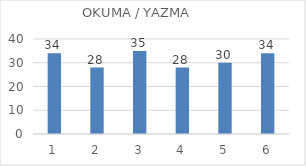
| Category | Series 0 |
|---|---|
| 0 | 34 |
| 1 | 28 |
| 2 | 35 |
| 3 | 28 |
| 4 | 30 |
| 5 | 34 |